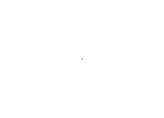
| Category | Series 0 |
|---|---|
| Available | 17351.46 |
| Picked | 0 |